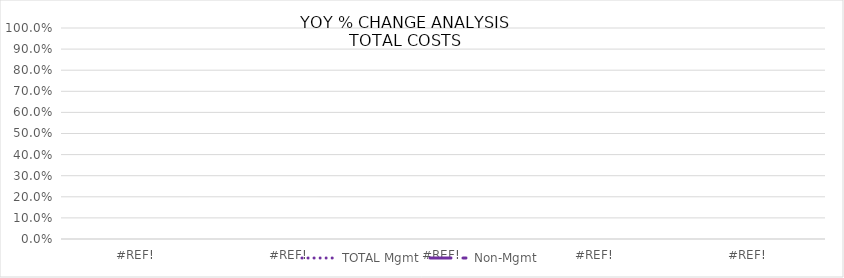
| Category | TOTAL |
|---|---|
| 0.0 | 0 |
| 0.0 | 0 |
| 0.0 | 0 |
| 0.0 | 0 |
| 0.0 | 0 |